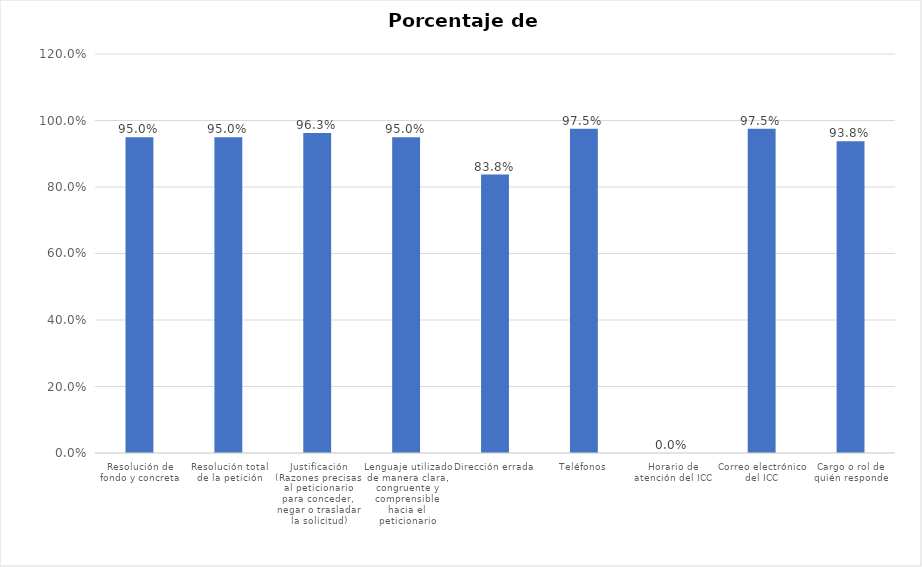
| Category | % Cumplimiento |
|---|---|
| Resolución de fondo y concreta | 0.95 |
| Resolución total de la petición | 0.95 |
| Justificación (Razones precisas al peticionario para conceder, negar o trasladar la solicitud) | 0.962 |
| Lenguaje utilizado de manera clara, congruente y comprensible hacia el peticionario | 0.95 |
| Dirección errada | 0.838 |
| Teléfonos | 0.975 |
| Horario de atención del ICC | 0 |
| Correo electrónico del ICC | 0.975 |
| Cargo o rol de quién responde | 0.938 |